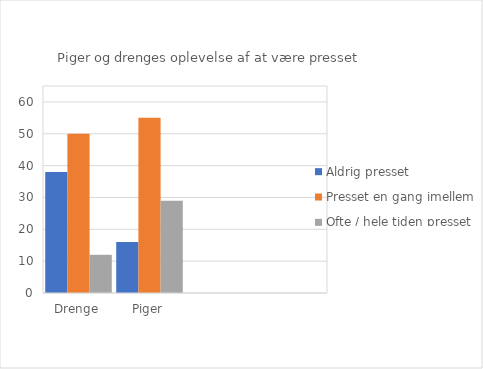
| Category | Aldrig presset | Presset en gang imellem | Ofte / hele tiden presset |
|---|---|---|---|
| Drenge | 38 | 50 | 12 |
| Piger | 16 | 55 | 29 |